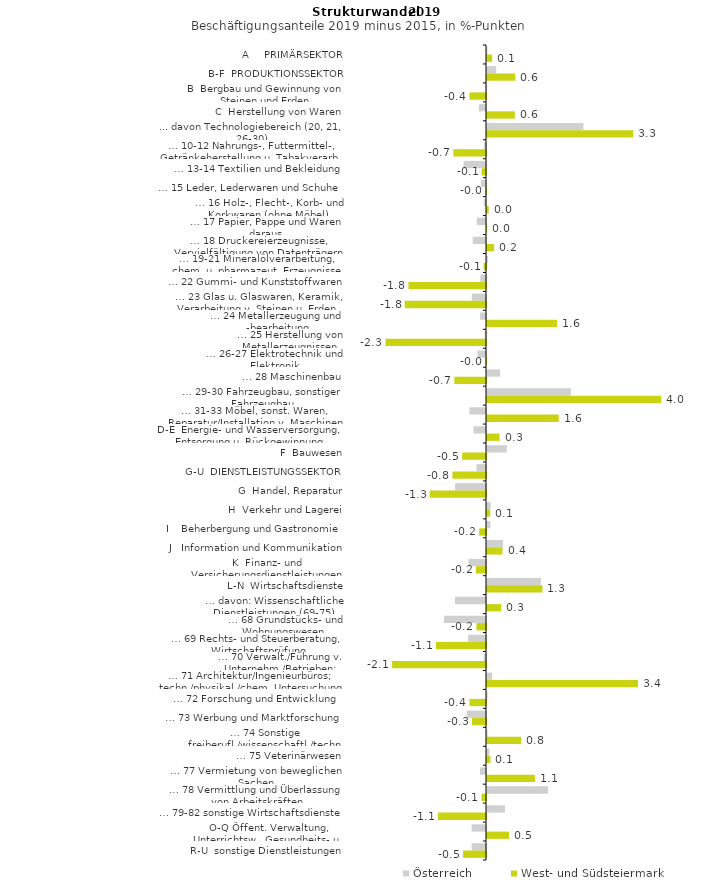
| Category | Österreich | West- und Südsteiermark |
|---|---|---|
| A     PRIMÄRSEKTOR | 0.009 | 0.118 |
| B-F  PRODUKTIONSSEKTOR | 0.208 | 0.643 |
| B  Bergbau und Gewinnung von Steinen und Erden | -0.008 | -0.377 |
| C  Herstellung von Waren | -0.159 | 0.633 |
| ... davon Technologiebereich (20, 21, 26-30) | 2.191 | 3.324 |
| … 10-12 Nahrungs-, Futtermittel-, Getränkeherstellung u. Tabakverarb. | -0.044 | -0.743 |
| … 13-14 Textilien und Bekleidung | -0.51 | -0.1 |
| … 15 Leder, Lederwaren und Schuhe | -0.114 | -0.02 |
| … 16 Holz-, Flecht-, Korb- und Korkwaren (ohne Möbel)  | -0.049 | 0.039 |
| … 17 Papier, Pappe und Waren daraus  | -0.209 | 0.003 |
| … 18 Druckereierzeugnisse, Vervielfältigung von Datenträgern | -0.302 | 0.162 |
| … 19-21 Mineralölverarbeitung, chem. u. pharmazeut. Erzeugnisse | 0.022 | -0.055 |
| … 22 Gummi- und Kunststoffwaren | -0.128 | -1.763 |
| … 23 Glas u. Glaswaren, Keramik, Verarbeitung v. Steinen u. Erden  | -0.322 | -1.848 |
| … 24 Metallerzeugung und -bearbeitung | -0.136 | 1.594 |
| … 25 Herstellung von Metallerzeugnissen  | -0.032 | -2.285 |
| … 26-27 Elektrotechnik und Elektronik | -0.193 | -0.011 |
| … 28 Maschinenbau | 0.297 | -0.72 |
| … 29-30 Fahrzeugbau, sonstiger Fahrzeugbau | 1.906 | 3.956 |
| … 31-33 Möbel, sonst. Waren, Reparatur/Installation v. Maschinen | -0.377 | 1.631 |
| D-E  Energie- und Wasserversorgung, Entsorgung u. Rückgewinnung | -0.284 | 0.285 |
| F  Bauwesen | 0.45 | -0.542 |
| G-U  DIENSTLEISTUNGSSEKTOR | -0.217 | -0.763 |
| G  Handel, Reparatur | -0.703 | -1.28 |
| H  Verkehr und Lagerei | 0.083 | 0.073 |
| I    Beherbergung und Gastronomie | 0.078 | -0.153 |
| J   Information und Kommunikation | 0.366 | 0.353 |
| K  Finanz- und Versicherungsdienstleistungen | -0.397 | -0.23 |
| L-N  Wirtschaftsdienste | 1.224 | 1.26 |
| … davon: Wissenschaftliche Dienstleistungen (69-75) | -0.706 | 0.324 |
| … 68 Grundstücks- und Wohnungswesen  | -0.954 | -0.217 |
| … 69 Rechts- und Steuerberatung, Wirtschaftsprüfung | -0.408 | -1.137 |
| … 70 Verwalt./Führung v. Unternehm./Betrieben; Unternehmensberat. | -0.052 | -2.134 |
| … 71 Architektur/Ingenieurbüros; techn./physikal./chem. Untersuchung | 0.116 | 3.432 |
| … 72 Forschung und Entwicklung  | 0.013 | -0.375 |
| … 73 Werbung und Marktforschung | -0.44 | -0.32 |
| … 74 Sonstige freiberufl./wissenschaftl./techn. Tätigkeiten | 0.011 | 0.78 |
| … 75 Veterinärwesen | 0.053 | 0.077 |
| … 77 Vermietung von beweglichen Sachen  | -0.137 | 1.091 |
| … 78 Vermittlung und Überlassung von Arbeitskräften | 1.388 | -0.102 |
| … 79-82 sonstige Wirtschaftsdienste | 0.408 | -1.091 |
| O-Q Öffent. Verwaltung, Unterrichtsw., Gesundheits- u. Sozialwesen | -0.326 | 0.5 |
| R-U  sonstige Dienstleistungen | -0.326 | -0.521 |